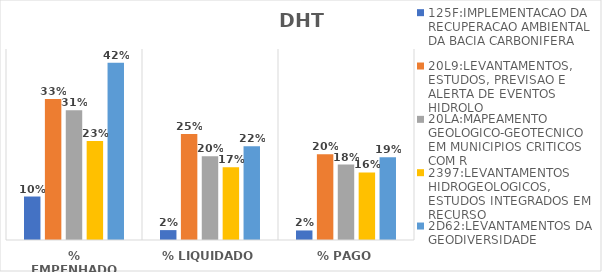
| Category | 125F:IMPLEMENTACAO DA RECUPERACAO AMBIENTAL DA BACIA CARBONIFERA | 20L9:LEVANTAMENTOS, ESTUDOS, PREVISAO E ALERTA DE EVENTOS HIDROLO | 20LA:MAPEAMENTO GEOLOGICO-GEOTECNICO EM MUNICIPIOS CRITICOS COM R | 2397:LEVANTAMENTOS HIDROGEOLOGICOS, ESTUDOS INTEGRADOS EM RECURSO | 2D62:LEVANTAMENTOS DA GEODIVERSIDADE |
|---|---|---|---|---|---|
| % EMPENHADO | 0.102 | 0.332 | 0.305 | 0.233 | 0.418 |
| % LIQUIDADO | 0.023 | 0.25 | 0.197 | 0.171 | 0.221 |
| % PAGO | 0.022 | 0.202 | 0.178 | 0.159 | 0.195 |